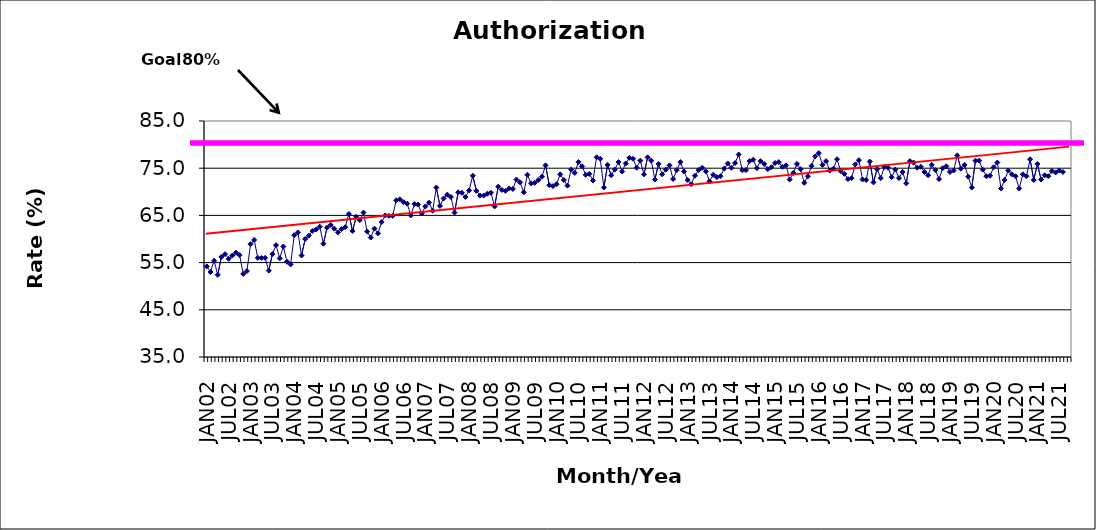
| Category | Series 0 |
|---|---|
| JAN02 | 54.2 |
| FEB02 | 53 |
| MAR02 | 55.4 |
| APR02 | 52.4 |
| MAY02 | 56.2 |
| JUN02 | 56.8 |
| JUL02 | 55.8 |
| AUG02 | 56.5 |
| SEP02 | 57.1 |
| OCT02 | 56.6 |
| NOV02 | 52.6 |
| DEC02 | 53.2 |
| JAN03 | 58.9 |
| FEB03 | 59.8 |
| MAR03 | 56 |
| APR03 | 56 |
| MAY03 | 56 |
| JUN03 | 53.3 |
| JUL03 | 56.8 |
| AUG03 | 58.7 |
| SEP03 | 55.9 |
| OCT03 | 58.4 |
| NOV03 | 55.2 |
| DEC03 | 54.6 |
| JAN04 | 60.8 |
| FEB04 | 61.4 |
| MAR04 | 56.5 |
| APR04 | 60 |
| MAY04 | 60.7 |
| JUN04 | 61.7 |
| JUL04 | 62 |
| AUG04 | 62.6 |
| SEP04 | 59 |
| OCT04 | 62.4 |
| NOV04 | 63 |
| DEC04 | 62.2 |
| JAN05 | 61.4 |
| FEB05 | 62.1 |
| MAR05 | 62.5 |
| APR05 | 65.3 |
| MAY05 | 61.7 |
| JUN05 | 64.7 |
| JUL05 | 64 |
| AUG05 | 65.6 |
| SEP05 | 61.6 |
| OCT05 | 60.3 |
| NOV05 | 62.2 |
| DEC05 | 61.2 |
| JAN06 | 63.6 |
| FEB06 | 65 |
| MAR06 | 64.9 |
| APR06 | 64.9 |
| MAY06 | 68.2 |
| JUN06 | 68.4 |
| JUL06 | 67.8 |
| AUG06 | 67.5 |
| SEP06 | 65 |
| OCT06 | 67.4 |
| NOV06 | 67.3 |
| DEC06 | 65.4 |
| JAN07 | 66.9 |
| FEB07 | 67.7 |
| MAR07 | 66 |
| APR07 | 70.9 |
| MAY07 | 67 |
| JUN07 | 68.6 |
| JUL07 | 69.4 |
| AUG07 | 68.9 |
| SEP07 | 65.6 |
| OCT07 | 69.9 |
| NOV07 | 69.8 |
| DEC07 | 68.9 |
| JAN08 | 70.3 |
| FEB08 | 73.4 |
| MAR08 | 70.2 |
| APR08 | 69.2 |
| MAY08 | 69.2 |
| JUN08 | 69.6 |
| JUL08 | 69.8 |
| AUG08 | 66.9 |
| SEP08 | 71.1 |
| OCT08 | 70.4 |
| NOV08 | 70.2 |
| DEC08 | 70.7 |
| JAN09 | 70.6 |
| FEB09 | 72.6 |
| MAR09 | 72 |
| APR09 | 69.9 |
| MAY09 | 73.6 |
| JUN09 | 71.8 |
| JUL09 | 71.9 |
| AUG09 | 72.5 |
| SEP09 | 73.2 |
| OCT09 | 75.6 |
| NOV09 | 71.4 |
| DEC09 | 71.2 |
| JAN10 | 71.6 |
| FEB10 | 73.7 |
| MAR10 | 72.5 |
| APR10 | 71.3 |
| MAY10 | 74.7 |
| JUN10 | 74 |
| JUL10 | 76.3 |
| AUG10 | 75.4 |
| SEP10 | 73.6 |
| OCT10 | 73.8 |
| NOV10 | 72.4 |
| DEC10 | 77.3 |
| JAN11 | 77 |
| FEB11 | 70.9 |
| MAR11 | 75.7 |
| APR11 | 73.5 |
| MAY11 | 74.7 |
| JUN11 | 76.3 |
| JUL11 | 74.3 |
| AUG11 | 76 |
| SEP11 | 77.2 |
| OCT11 | 77 |
| NOV11 | 75.1 |
| DEC11 | 76.6 |
| JAN12 | 73.7 |
| FEB12 | 77.3 |
| MAR12 | 76.6 |
| APR12 | 72.6 |
| MAY12 | 75.9 |
| JUN12 | 73.7 |
| JUL12 | 74.7 |
| AUG12 | 75.6 |
| SEP12 | 72.7 |
| OCT12 | 74.6 |
| NOV12 | 76.3 |
| DEC12 | 74.3 |
| JAN13 | 72.5 |
| FEB13 | 71.6 |
| MAR13 | 73.4 |
| APR13 | 74.6 |
| MAY13 | 75.1 |
| JUN13 | 74.3 |
| JUL13 | 72.2 |
| AUG13 | 73.6 |
| SEP13 | 73.1 |
| OCT13 | 73.3 |
| NOV13 | 74.9 |
| DEC13 | 76 |
| JAN14 | 75.1 |
| FEB14 | 76.1 |
| MAR14 | 77.9 |
| APR14 | 74.6 |
| MAY14 | 74.6 |
| JUN14 | 76.5 |
| JUL14 | 76.8 |
| AUG14 | 75 |
| SEP14 | 76.5 |
| OCT14 | 75.9 |
| NOV14 | 74.8 |
| DEC14 | 75.2 |
| JAN15 | 76.1 |
| FEB15 | 76.3 |
| MAR15 | 75.3 |
| APR15 | 75.6 |
| MAY15 | 72.6 |
| JUN15 | 74 |
| JUL15 | 75.9 |
| AUG15 | 74.8 |
| SEP15 | 71.9 |
| OCT15 | 73.3 |
| NOV15 | 75.5 |
| DEC15 | 77.5 |
| JAN16 | 78.2 |
| FEB16 | 75.7 |
| MAR16 | 76.5 |
| APR16 | 74.5 |
| MAY16 | 74.9 |
| JUN16 | 76.9 |
| JUL16 | 74.4 |
| AUG16 | 73.8 |
| SEP16 | 72.7 |
| OCT16 | 72.9 |
| NOV16 | 75.8 |
| DEC16 | 76.7 |
| JAN17 | 72.6 |
| FEB17 | 72.5 |
| MAR17 | 76.4 |
| APR17 | 72 |
| MAY17 | 74.8 |
| JUN17 | 72.9 |
| JUL17 | 75.3 |
| AUG17 | 75.1 |
| SEP17 | 73.1 |
| OCT17 | 74.7 |
| NOV17 | 72.9 |
| DEC17 | 74.2 |
| JAN18 | 71.8 |
| FEB18 | 76.5 |
| MAR18 | 76.2 |
| APR18 | 75.1 |
| MAY18 | 75.3 |
| JUN18 | 74.2 |
| JUL18 | 73.5 |
| AUG18 | 75.7 |
| SEP18 | 74.6 |
| OCT18 | 72.7 |
| NOV18 | 75 |
| DEC18 | 75.4 |
| JAN19 | 74.2 |
| FEB19 | 74.5 |
| MAR19 | 77.7 |
| APR19 | 74.9 |
| MAY19 | 75.7 |
| JUN19 | 73.2 |
| JUL19 | 70.9 |
| AUG19 | 76.6 |
| SEP19 | 76.6 |
| OCT19 | 74.7 |
| NOV19 | 73.3 |
| DEC19 | 73.4 |
| JAN20 | 75.2 |
| FEB20 | 76.2 |
| MAR20 | 70.7 |
| APR20 | 72.5 |
| MAY20 | 74.5 |
| JUN20 | 73.7 |
| JUL20 | 73.3 |
| AUG20 | 70.7 |
| SEP20 | 73.7 |
| OCT20 | 73.3 |
| NOV20 | 76.9 |
| DEC20 | 72.5 |
| JAN21 | 75.9 |
| FEB21 | 72.6 |
| MAR21 | 73.5 |
| APR21 | 73.3 |
| MAY21 | 74.4 |
| JUN21 | 74.1 |
| JUL21 | 74.5 |
| AUG21 | 74.2 |